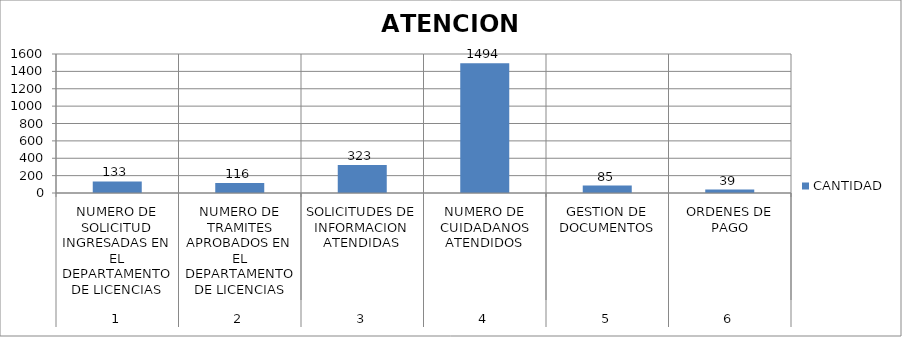
| Category | CANTIDAD |
|---|---|
| 0 | 133 |
| 1 | 116 |
| 2 | 323 |
| 3 | 1494 |
| 4 | 85 |
| 5 | 39 |